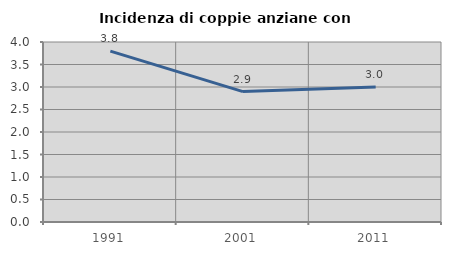
| Category | Incidenza di coppie anziane con figli |
|---|---|
| 1991.0 | 3.797 |
| 2001.0 | 2.899 |
| 2011.0 | 3 |